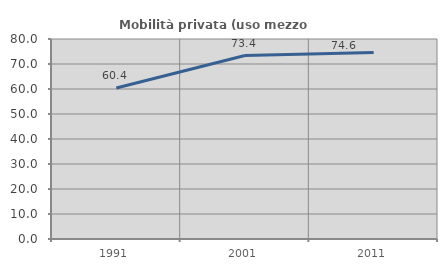
| Category | Mobilità privata (uso mezzo privato) |
|---|---|
| 1991.0 | 60.386 |
| 2001.0 | 73.395 |
| 2011.0 | 74.603 |